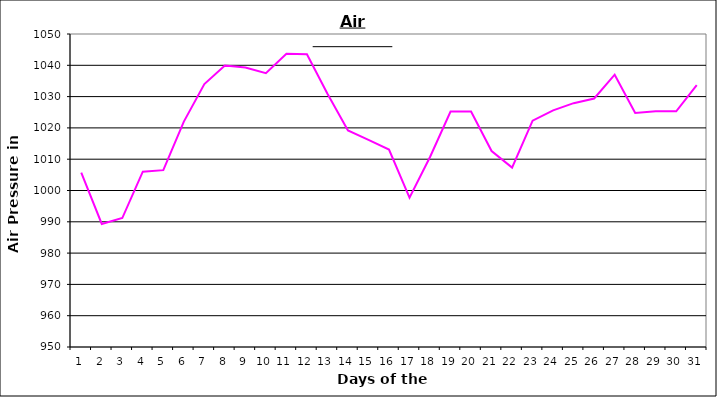
| Category | Series 0 |
|---|---|
| 0 | 1005.7 |
| 1 | 989.3 |
| 2 | 991.2 |
| 3 | 1006 |
| 4 | 1006.5 |
| 5 | 1022 |
| 6 | 1034 |
| 7 | 1039.9 |
| 8 | 1039.3 |
| 9 | 1037.5 |
| 10 | 1043.7 |
| 11 | 1043.5 |
| 12 | 1030.9 |
| 13 | 1019.2 |
| 14 | 1016.2 |
| 15 | 1013.1 |
| 16 | 997.7 |
| 17 | 1010.7 |
| 18 | 1025.2 |
| 19 | 1025.2 |
| 20 | 1012.6 |
| 21 | 1007.3 |
| 22 | 1022.3 |
| 23 | 1025.6 |
| 24 | 1027.9 |
| 25 | 1029.4 |
| 26 | 1037 |
| 27 | 1024.8 |
| 28 | 1025.3 |
| 29 | 1025.3 |
| 30 | 1033.7 |